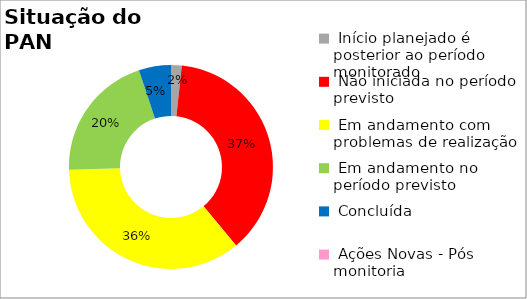
| Category | Series 0 |
|---|---|
|  Início planejado é posterior ao período monitorado | 0.017 |
|  Não iniciada no período previsto | 0.373 |
|  Em andamento com problemas de realização | 0.356 |
|  Em andamento no período previsto  | 0.203 |
|  Concluída | 0.051 |
|  Ações Novas - Pós monitoria | 0 |